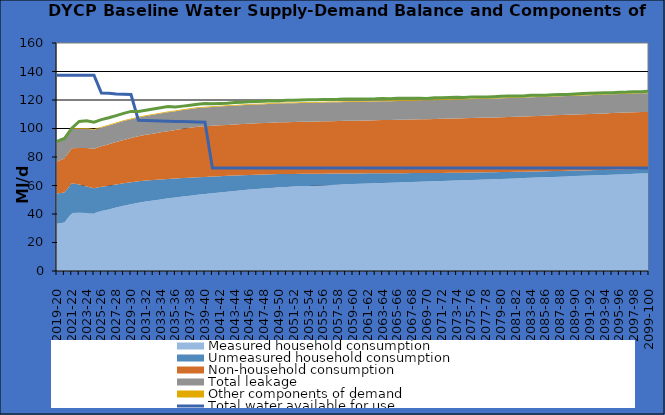
| Category | Total water available for use | Total demand + target headroom (baseline) |
|---|---|---|
| 0 | 137.38 | 90.94 |
| 1 | 137.38 | 92.984 |
| 2 | 137.38 | 100.244 |
| 3 | 137.38 | 104.965 |
| 4 | 137.38 | 105.495 |
| 5 | 137.38 | 104.478 |
| 6 | 124.828 | 106.199 |
| 7 | 124.68 | 107.55 |
| 8 | 124.172 | 109.039 |
| 9 | 124.024 | 110.633 |
| 10 | 123.876 | 112.004 |
| 11 | 105.718 | 111.875 |
| 12 | 105.57 | 112.797 |
| 13 | 105.423 | 113.654 |
| 14 | 105.275 | 114.614 |
| 15 | 105.127 | 115.358 |
| 16 | 104.979 | 115.015 |
| 17 | 104.831 | 115.709 |
| 18 | 104.683 | 116.335 |
| 19 | 104.535 | 117.012 |
| 20 | 104.387 | 117.601 |
| 21 | 72.35 | 117.307 |
| 22 | 72.35 | 117.51 |
| 23 | 72.35 | 117.69 |
| 24 | 72.35 | 118.211 |
| 25 | 72.35 | 118.338 |
| 26 | 72.35 | 118.782 |
| 27 | 72.35 | 118.984 |
| 28 | 72.35 | 119.177 |
| 29 | 72.35 | 119.47 |
| 30 | 72.35 | 119.374 |
| 31 | 72.35 | 119.762 |
| 32 | 72.35 | 119.855 |
| 33 | 72.35 | 119.99 |
| 34 | 72.35 | 120.131 |
| 35 | 72.35 | 120.141 |
| 36 | 72.35 | 120.385 |
| 37 | 72.35 | 120.427 |
| 38 | 72.35 | 120.492 |
| 39 | 72.35 | 120.693 |
| 40 | 72.35 | 120.685 |
| 41 | 72.35 | 120.771 |
| 42 | 72.35 | 120.773 |
| 43 | 72.35 | 120.823 |
| 44 | 72.35 | 121.09 |
| 45 | 72.35 | 120.954 |
| 46 | 72.35 | 121.184 |
| 47 | 72.35 | 121.166 |
| 48 | 72.35 | 121.315 |
| 49 | 72.35 | 121.287 |
| 50 | 72.35 | 121.138 |
| 51 | 72.35 | 121.526 |
| 52 | 72.35 | 121.506 |
| 53 | 72.35 | 121.774 |
| 54 | 72.35 | 121.896 |
| 55 | 72.35 | 121.76 |
| 56 | 72.35 | 122.166 |
| 57 | 72.35 | 122.049 |
| 58 | 72.35 | 122.171 |
| 59 | 72.35 | 122.347 |
| 60 | 72.35 | 122.612 |
| 61 | 72.35 | 122.747 |
| 62 | 72.35 | 122.875 |
| 63 | 72.35 | 122.846 |
| 64 | 72.35 | 123.263 |
| 65 | 72.35 | 123.319 |
| 66 | 72.35 | 123.292 |
| 67 | 72.35 | 123.759 |
| 68 | 72.35 | 123.869 |
| 69 | 72.35 | 123.897 |
| 70 | 72.35 | 124.237 |
| 71 | 72.35 | 124.553 |
| 72 | 72.35 | 124.755 |
| 73 | 72.35 | 124.868 |
| 74 | 72.35 | 125.03 |
| 75 | 72.35 | 125.045 |
| 76 | 72.35 | 125.417 |
| 77 | 72.35 | 125.528 |
| 78 | 72.35 | 125.792 |
| 79 | 72.35 | 125.832 |
| 80 | 72.35 | 126.186 |